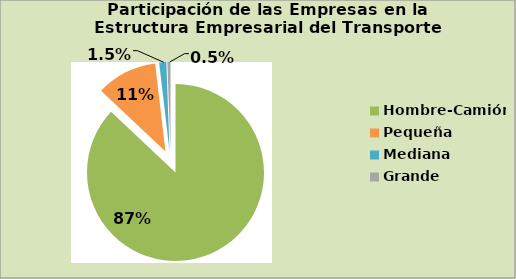
| Category | Series 0 |
|---|---|
| Hombre-Camión | 87.012 |
| Pequeña | 11.116 |
| Mediana | 1.301 |
| Grande | 0.571 |